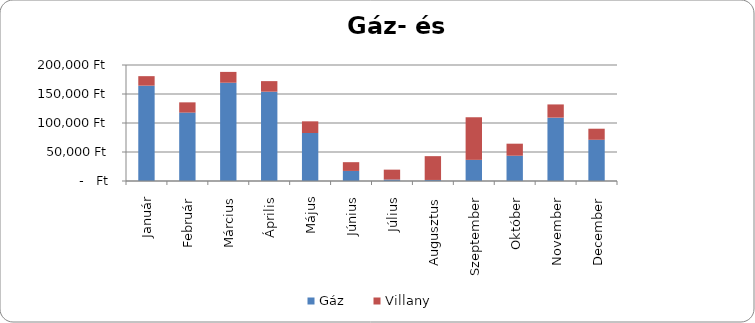
| Category | Gáz | Villany |
|---|---|---|
| Január | 164360 | 16400 |
| Február | 117930 | 17680 |
| Március | 169410 | 18690 |
| Április | 153990 | 18210 |
| Május | 82760 | 20120 |
| Június | 17390 | 15060 |
| Július | 2500 | 17080 |
| Augusztus | 1800 | 41050 |
| Szeptember | 36440 | 73470 |
| Október | 43570 | 20770 |
| November | 109240 | 22780 |
| December | 71040 | 19110 |